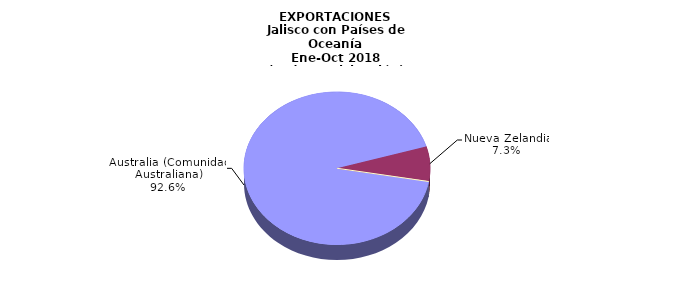
| Category | EXPORTACIONES |
|---|---|
| Australia (Comunidad Australiana) | 154.711 |
| Nueva Zelandia | 12.205 |
| Otros | 0.128 |